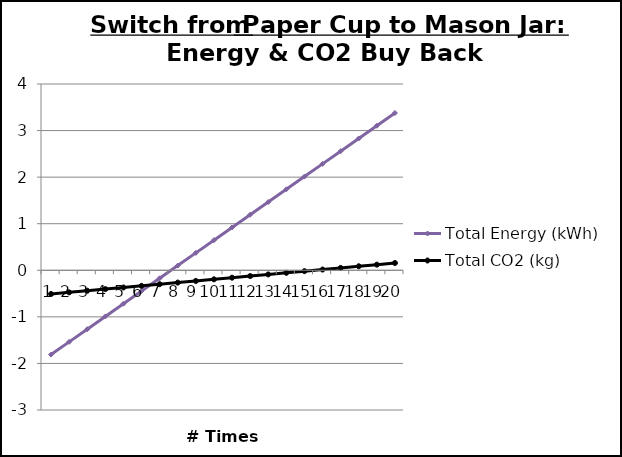
| Category | Total Energy (kWh) | Total CO2 (kg) |
|---|---|---|
| 0 | -1.81 | -0.509 |
| 1 | -1.537 | -0.474 |
| 2 | -1.264 | -0.439 |
| 3 | -0.991 | -0.404 |
| 4 | -0.718 | -0.369 |
| 5 | -0.445 | -0.334 |
| 6 | -0.172 | -0.299 |
| 7 | 0.101 | -0.264 |
| 8 | 0.374 | -0.229 |
| 9 | 0.647 | -0.194 |
| 10 | 0.92 | -0.159 |
| 11 | 1.193 | -0.124 |
| 12 | 1.466 | -0.089 |
| 13 | 1.739 | -0.054 |
| 14 | 2.012 | -0.019 |
| 15 | 2.285 | 0.016 |
| 16 | 2.558 | 0.051 |
| 17 | 2.831 | 0.086 |
| 18 | 3.104 | 0.121 |
| 19 | 3.377 | 0.156 |